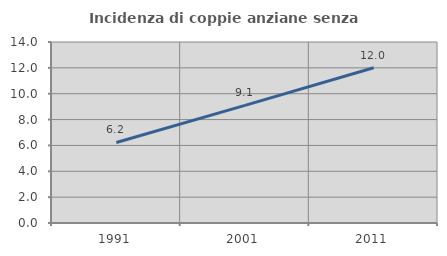
| Category | Incidenza di coppie anziane senza figli  |
|---|---|
| 1991.0 | 6.227 |
| 2001.0 | 9.1 |
| 2011.0 | 12.01 |